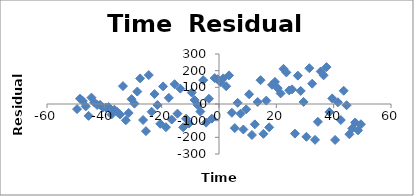
| Category | Series 0 |
|---|---|
| -49.5 | -30.679 |
| -48.5 | 31.987 |
| -47.5 | 17.972 |
| -46.5 | -14.158 |
| -45.5 | -71.006 |
| -44.5 | 38.523 |
| -43.5 | 9.94 |
| -42.5 | -5.837 |
| -41.5 | -4.79 |
| -40.5 | -20.642 |
| -39.5 | -21.058 |
| -38.5 | -18.115 |
| -37.5 | -63.053 |
| -36.5 | -34.156 |
| -35.5 | -47.869 |
| -34.5 | -62.753 |
| -33.5 | 107.375 |
| -32.5 | -97.513 |
| -31.5 | -53.748 |
| -30.5 | 28.937 |
| -29.5 | 2.418 |
| -28.5 | 74.625 |
| -27.5 | 153.445 |
| -26.5 | -96.078 |
| -25.5 | -162.779 |
| -24.5 | 173.7 |
| -23.5 | -46.552 |
| -22.5 | 59.504 |
| -21.5 | -5.737 |
| -20.5 | -119.016 |
| -19.5 | 105.676 |
| -18.5 | -139.311 |
| -17.5 | 36.871 |
| -16.5 | -93.434 |
| -15.5 | 118.735 |
| -14.5 | -57.864 |
| -13.5 | 92.082 |
| -12.5 | -139.898 |
| -11.5 | -88.464 |
| -10.5 | -117.241 |
| -9.5 | 68.705 |
| -8.5 | 23.405 |
| -7.5 | -4.978 |
| -6.5 | -45.192 |
| -5.5 | 143.073 |
| -4.5 | -111.852 |
| -3.5 | 31.355 |
| -2.5 | -87.776 |
| -1.5 | 155.656 |
| -0.5 | 148.551 |
| 0.5 | 131.034 |
| 1.5 | 153.847 |
| 2.5 | 106.783 |
| 3.5 | 171.604 |
| 4.5 | -52.66 |
| 5.5 | -144.5 |
| 6.5 | 7.012 |
| 7.5 | -58.322 |
| 8.5 | -152.998 |
| 9.5 | -32.056 |
| 10.5 | 58.082 |
| 11.5 | -185.999 |
| 12.5 | -122.03 |
| 13.5 | 12.128 |
| 14.5 | 142.959 |
| 15.5 | -178.967 |
| 16.5 | 19.986 |
| 17.5 | -139.985 |
| 18.5 | 115.251 |
| 19.5 | 132.632 |
| 20.5 | 95.006 |
| 21.5 | 63.673 |
| 22.5 | 211.096 |
| 23.5 | 189.642 |
| 24.5 | 81.45 |
| 25.5 | 87.883 |
| 26.5 | -177.645 |
| 27.5 | 170.066 |
| 28.5 | 78.436 |
| 29.5 | 12.419 |
| 30.5 | -196.811 |
| 31.5 | 214.804 |
| 32.5 | 121.763 |
| 33.5 | -215.003 |
| 34.5 | -107.108 |
| 35.5 | 195.306 |
| 36.5 | 171.987 |
| 37.5 | 221.435 |
| 38.5 | -48.366 |
| 39.5 | 33.382 |
| 40.5 | -215.618 |
| 41.5 | 10.302 |
| 42.5 | -96.123 |
| 43.5 | 79.566 |
| 44.5 | -7.619 |
| 45.5 | -181.633 |
| 46.5 | -146.665 |
| 47.5 | -110.889 |
| 48.5 | -157.958 |
| 49.5 | -121.56 |